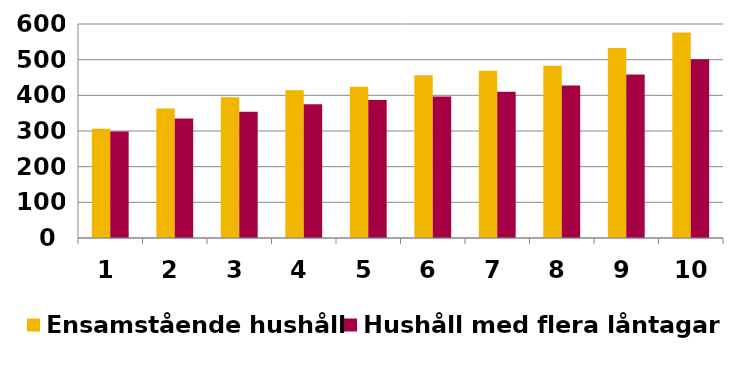
| Category | Ensamstående hushåll | Hushåll med flera låntagare |
|---|---|---|
| 1.0 | 306.31 | 298.357 |
| 2.0 | 362.781 | 335.322 |
| 3.0 | 394.884 | 354.238 |
| 4.0 | 414.484 | 374.788 |
| 5.0 | 424.366 | 386.951 |
| 6.0 | 456.225 | 396.663 |
| 7.0 | 468.966 | 410.156 |
| 8.0 | 482.608 | 427.477 |
| 9.0 | 532.77 | 458.239 |
| 10.0 | 576.411 | 501.461 |